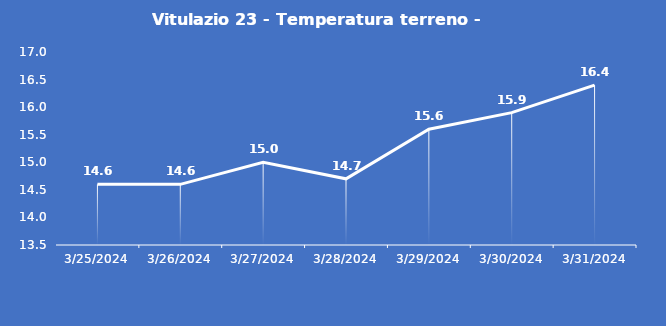
| Category | Vitulazio 23 - Temperatura terreno - Grezzo (°C) |
|---|---|
| 3/25/24 | 14.6 |
| 3/26/24 | 14.6 |
| 3/27/24 | 15 |
| 3/28/24 | 14.7 |
| 3/29/24 | 15.6 |
| 3/30/24 | 15.9 |
| 3/31/24 | 16.4 |